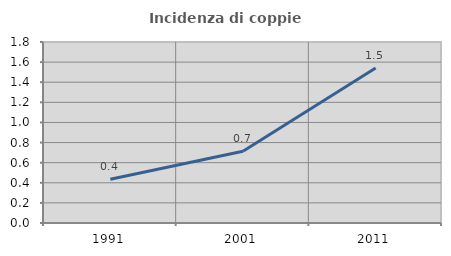
| Category | Incidenza di coppie miste |
|---|---|
| 1991.0 | 0.435 |
| 2001.0 | 0.713 |
| 2011.0 | 1.542 |